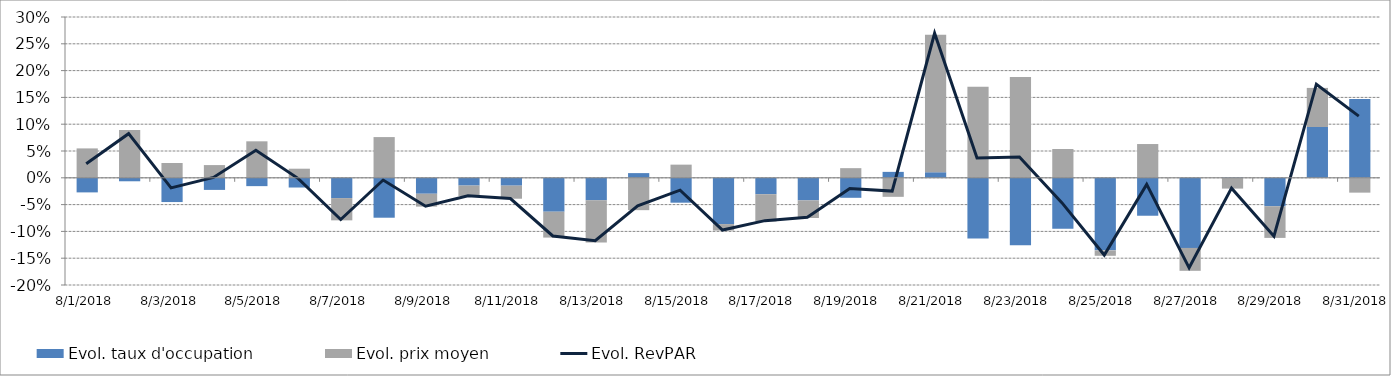
| Category | Evol. taux d'occupation | Evol. prix moyen |
|---|---|---|
| 8/1/18 | -0.027 | 0.055 |
| 8/2/18 | -0.006 | 0.089 |
| 8/3/18 | -0.045 | 0.028 |
| 8/4/18 | -0.023 | 0.024 |
| 8/5/18 | -0.016 | 0.068 |
| 8/6/18 | -0.018 | 0.017 |
| 8/7/18 | -0.038 | -0.042 |
| 8/8/18 | -0.074 | 0.076 |
| 8/9/18 | -0.03 | -0.024 |
| 8/10/18 | -0.014 | -0.019 |
| 8/11/18 | -0.015 | -0.024 |
| 8/12/18 | -0.063 | -0.048 |
| 8/13/18 | -0.042 | -0.079 |
| 8/14/18 | 0.009 | -0.06 |
| 8/15/18 | -0.046 | 0.025 |
| 8/16/18 | -0.086 | -0.012 |
| 8/17/18 | -0.031 | -0.051 |
| 8/18/18 | -0.042 | -0.033 |
| 8/19/18 | -0.037 | 0.018 |
| 8/20/18 | 0.011 | -0.035 |
| 8/21/18 | 0.01 | 0.257 |
| 8/22/18 | -0.113 | 0.17 |
| 8/23/18 | -0.126 | 0.188 |
| 8/24/18 | -0.095 | 0.054 |
| 8/25/18 | -0.135 | -0.01 |
| 8/26/18 | -0.071 | 0.063 |
| 8/27/18 | -0.131 | -0.043 |
| 8/28/18 | 0.001 | -0.02 |
| 8/29/18 | -0.053 | -0.059 |
| 8/30/18 | 0.095 | 0.073 |
| 8/31/18 | 0.147 | -0.028 |